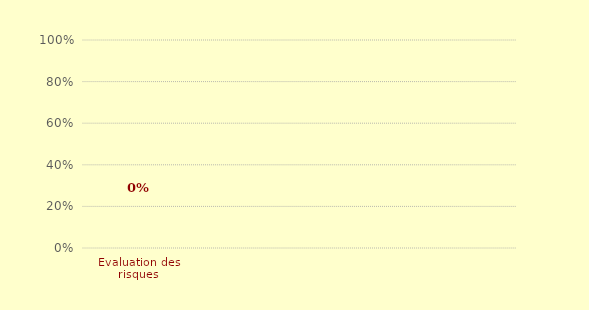
| Category | Série 1 | Series 1 |
|---|---|---|
| Evaluation des risques | 0 | 0 |